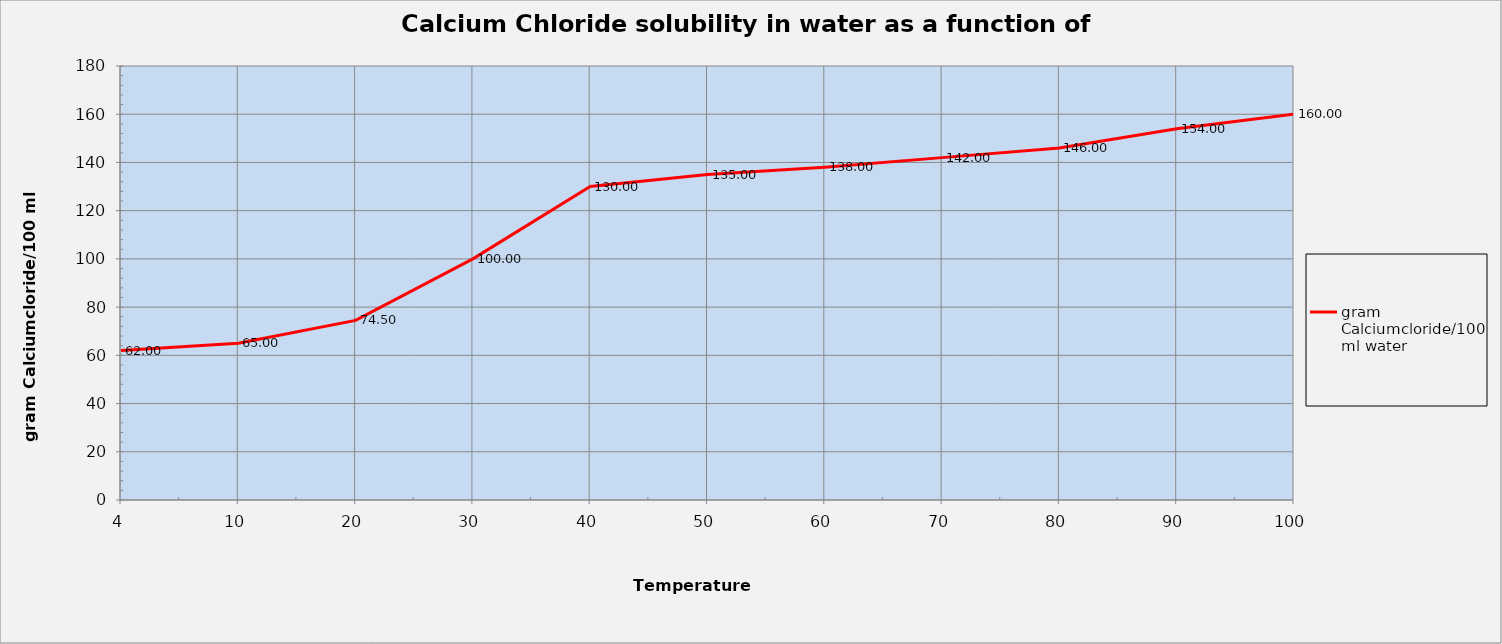
| Category | gram Calciumcloride/100 ml water |
|---|---|
| 4.0 | 62 |
| 10.0 | 65 |
| 20.0 | 74.5 |
| 30.0 | 100 |
| 40.0 | 130 |
| 50.0 | 135 |
| 60.0 | 138 |
| 70.0 | 142 |
| 80.0 | 146 |
| 90.0 | 154 |
| 100.0 | 160 |